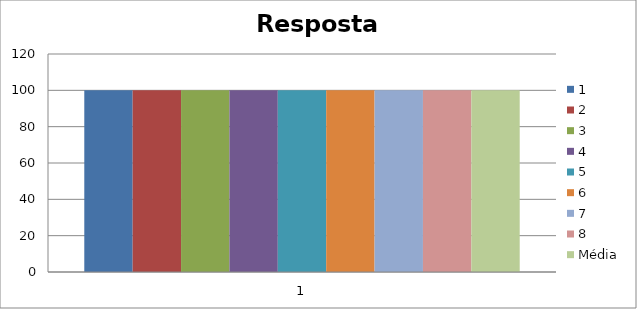
| Category | 1 | 2 | 3 | 4 | 5 | 6 | 7 | 8 | Média |
|---|---|---|---|---|---|---|---|---|---|
| 0 | 100 | 100 | 100 | 100 | 100 | 100 | 100 | 100 | 100 |